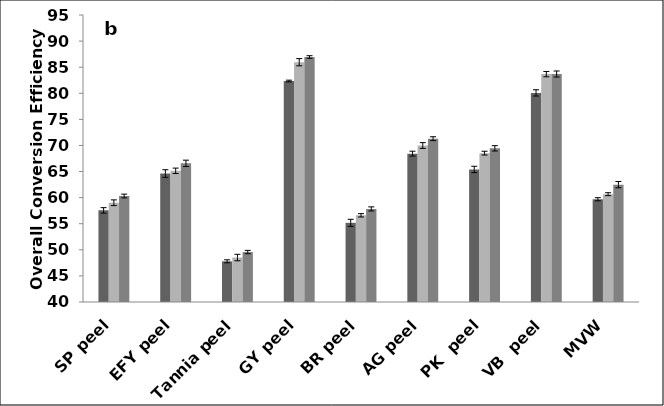
| Category | LRT  24 h | LRT  48 h | LHT  60 min. |
|---|---|---|---|
| SP peel | 57.56 | 59.02 | 60.31 |
| EFY peel | 64.62 | 65.14 | 66.57 |
| Tannia peel | 47.8 | 48.52 | 49.57 |
| GY peel | 82.34 | 85.95 | 86.95 |
| BR peel | 55.17 | 56.61 | 57.84 |
| AG peel | 68.43 | 69.99 | 71.3 |
| PK  peel | 65.4 | 68.53 | 69.45 |
| VB  peel | 80.07 | 83.67 | 83.69 |
| MVW | 59.69 | 60.66 | 62.49 |